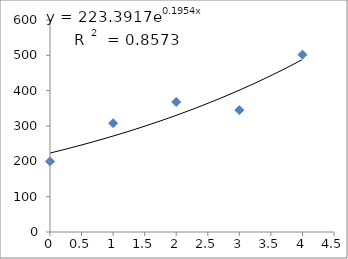
| Category | Series 0 |
|---|---|
| 0.0 | 200 |
| 1.0 | 308 |
| 2.0 | 368 |
| 3.0 | 345 |
| 4.0 | 502 |